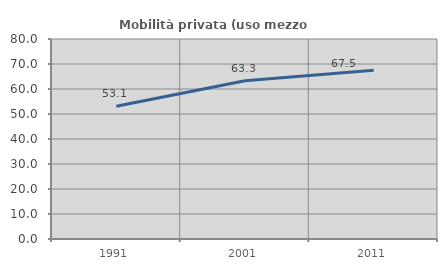
| Category | Mobilità privata (uso mezzo privato) |
|---|---|
| 1991.0 | 53.114 |
| 2001.0 | 63.324 |
| 2011.0 | 67.516 |